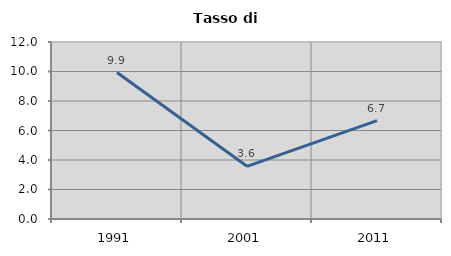
| Category | Tasso di disoccupazione   |
|---|---|
| 1991.0 | 9.932 |
| 2001.0 | 3.571 |
| 2011.0 | 6.667 |